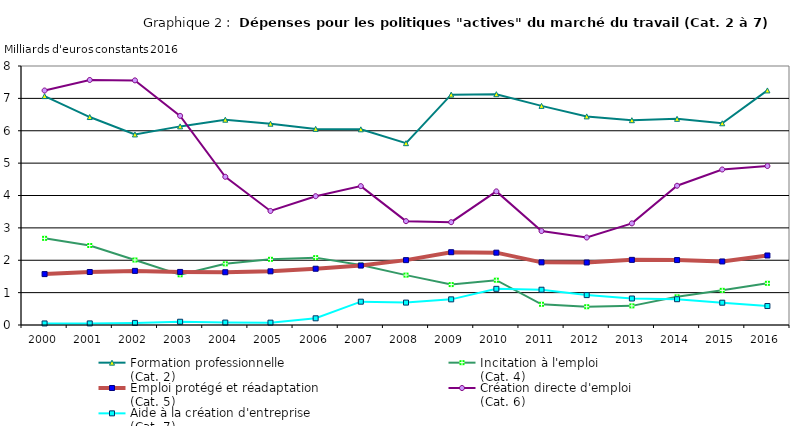
| Category | Formation professionnelle 
(Cat. 2) | Incitation à l'emploi  
(Cat. 4) | Emploi protégé et réadaptation 
(Cat. 5) | Création directe d'emploi  
(Cat. 6) | Aide à la création d'entreprise 
(Cat. 7) |
|---|---|---|---|---|---|
| 2000.0 | 7.07 | 2.677 | 1.572 | 7.243 | 0.048 |
| 2001.0 | 6.424 | 2.455 | 1.637 | 7.569 | 0.049 |
| 2002.0 | 5.886 | 2.008 | 1.672 | 7.556 | 0.064 |
| 2003.0 | 6.135 | 1.551 | 1.639 | 6.46 | 0.101 |
| 2004.0 | 6.341 | 1.89 | 1.63 | 4.578 | 0.076 |
| 2005.0 | 6.217 | 2.029 | 1.658 | 3.522 | 0.073 |
| 2006.0 | 6.057 | 2.081 | 1.738 | 3.979 | 0.207 |
| 2007.0 | 6.044 | 1.851 | 1.836 | 4.289 | 0.721 |
| 2008.0 | 5.616 | 1.541 | 2.004 | 3.207 | 0.692 |
| 2009.0 | 7.116 | 1.248 | 2.248 | 3.176 | 0.792 |
| 2010.0 | 7.13 | 1.384 | 2.234 | 4.127 | 1.117 |
| 2011.0 | 6.769 | 0.64 | 1.935 | 2.902 | 1.09 |
| 2012.0 | 6.443 | 0.565 | 1.931 | 2.703 | 0.924 |
| 2013.0 | 6.326 | 0.591 | 2.012 | 3.139 | 0.818 |
| 2014.0 | 6.368 | 0.871 | 2.006 | 4.301 | 0.796 |
| 2015.0 | 6.231 | 1.07 | 1.963 | 4.803 | 0.689 |
| 2016.0 | 7.246 | 1.288 | 2.147 | 4.911 | 0.586 |